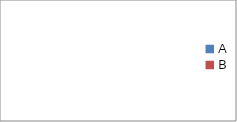
| Category | Series 0 |
|---|---|
| A | 0 |
| B | 0 |